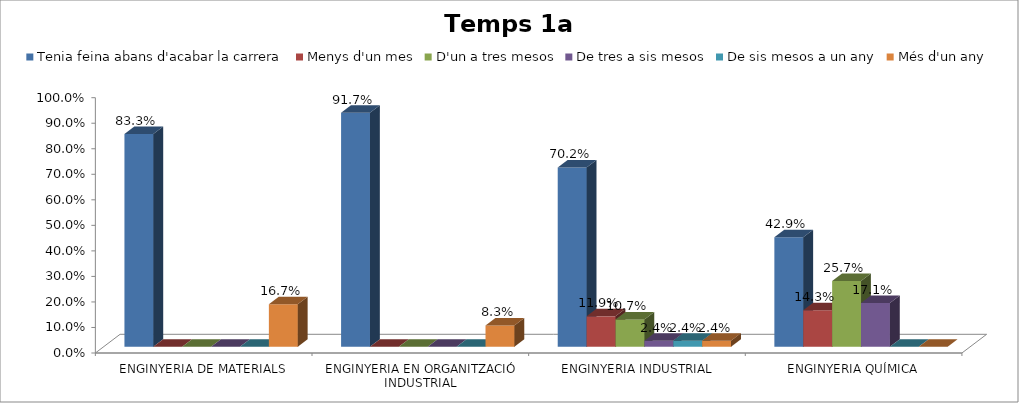
| Category | Tenia feina abans d'acabar la carrera | Menys d'un mes | D'un a tres mesos | De tres a sis mesos | De sis mesos a un any | Més d'un any |
|---|---|---|---|---|---|---|
| ENGINYERIA DE MATERIALS | 0.833 | 0 | 0 | 0 | 0 | 0.167 |
| ENGINYERIA EN ORGANITZACIÓ INDUSTRIAL | 0.917 | 0 | 0 | 0 | 0 | 0.083 |
| ENGINYERIA INDUSTRIAL | 0.702 | 0.119 | 0.107 | 0.024 | 0.024 | 0.024 |
| ENGINYERIA QUÍMICA | 0.429 | 0.143 | 0.257 | 0.171 | 0 | 0 |